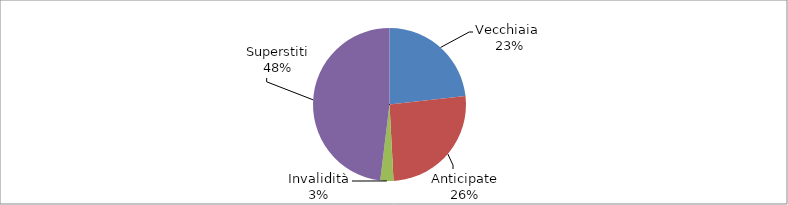
| Category | Series 0 |
|---|---|
| Vecchiaia  | 8535 |
| Anticipate | 9520 |
| Invalidità | 1019 |
| Superstiti | 17653 |